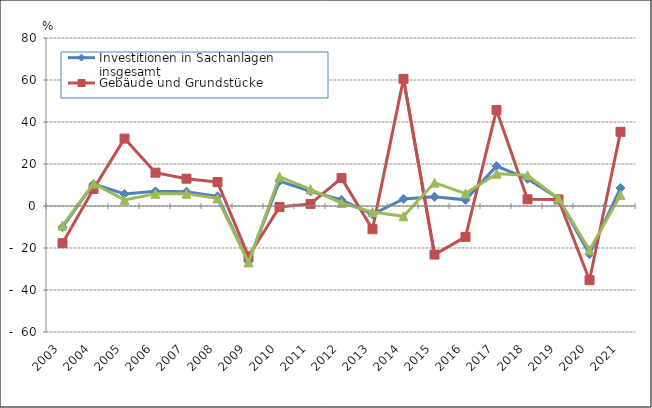
| Category | Investitionen in Sachanlagen insgesamt | Gebäude und Grundstücke | Maschinen und Betriebsausstattung |
|---|---|---|---|
| 2003.0 | -10.1 | -17.7 | -9.3 |
| 2004.0 | 10.5 | 8.1 | 10.7 |
| 2005.0 | 5.7 | 32.1 | 2.9 |
| 2006.0 | 6.991 | 15.857 | 5.812 |
| 2007.0 | 6.796 | 13.004 | 5.891 |
| 2008.0 | 4.6 | 11.4 | 3.579 |
| 2009.0 | -26.476 | -23.99 | -26.892 |
| 2010.0 | 11.843 | -0.455 | 13.982 |
| 2011.0 | 7.019 | 1.003 | 7.933 |
| 2012.0 | 2.918 | 13.273 | 1.446 |
| 2013.0 | -3.946 | -11.028 | -2.822 |
| 2014.0 | 3.39 | 60.554 | -4.916 |
| 2015.0 | 4.363 | -23.122 | 11.106 |
| 2016.0 | 2.923 | -14.713 | 5.917 |
| 2017.0 | 18.993 | 45.739 | 15.337 |
| 2018.0 | 12.959 | 3.178 | 14.649 |
| 2019.0 | 3.525 | 3.127 | 3.587 |
| 2020.0 | -22.979 | -35.342 | -21.066 |
| 2021.0 | 8.607 | 35.333 | 5.219 |